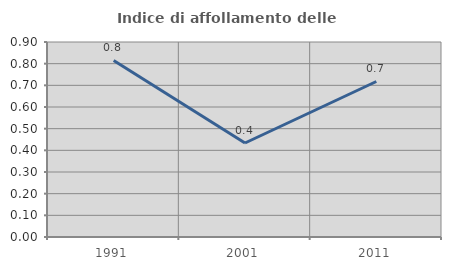
| Category | Indice di affollamento delle abitazioni  |
|---|---|
| 1991.0 | 0.815 |
| 2001.0 | 0.434 |
| 2011.0 | 0.718 |